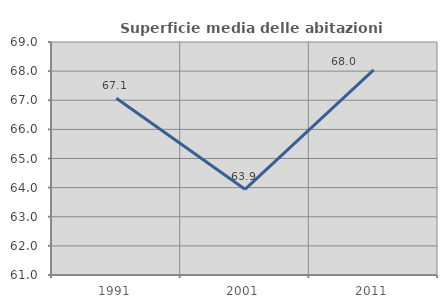
| Category | Superficie media delle abitazioni occupate |
|---|---|
| 1991.0 | 67.072 |
| 2001.0 | 63.942 |
| 2011.0 | 68.043 |